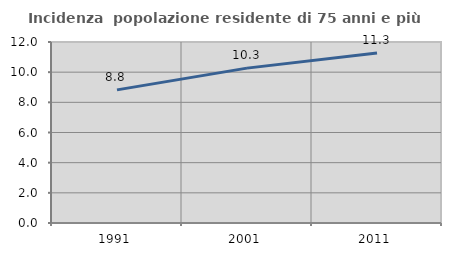
| Category | Incidenza  popolazione residente di 75 anni e più |
|---|---|
| 1991.0 | 8.826 |
| 2001.0 | 10.268 |
| 2011.0 | 11.276 |